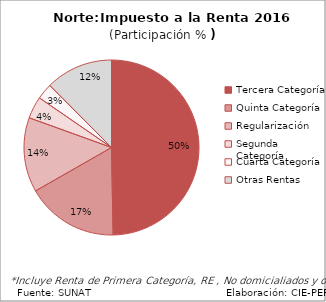
| Category | Series 0 |
|---|---|
| Tercera Categoría | 808.389 |
| Quinta Categoría | 277 |
| Regularización | 224.031 |
| Segunda Categoría | 66.46 |
| Cuarta Categoría | 47.902 |
| Otras Rentas | 202.642 |